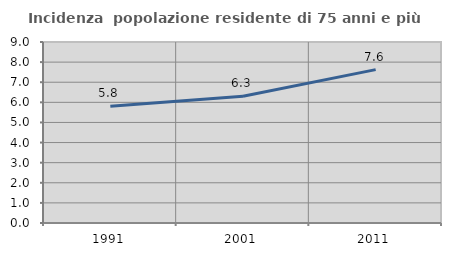
| Category | Incidenza  popolazione residente di 75 anni e più |
|---|---|
| 1991.0 | 5.807 |
| 2001.0 | 6.304 |
| 2011.0 | 7.626 |